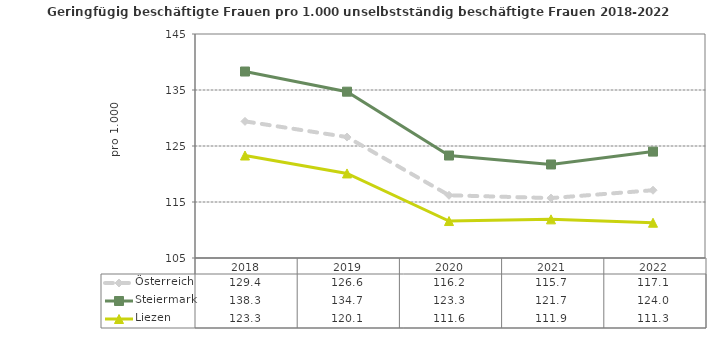
| Category | Österreich | Steiermark | Liezen |
|---|---|---|---|
| 2022.0 | 117.1 | 124 | 111.3 |
| 2021.0 | 115.7 | 121.7 | 111.9 |
| 2020.0 | 116.2 | 123.3 | 111.6 |
| 2019.0 | 126.6 | 134.7 | 120.1 |
| 2018.0 | 129.4 | 138.3 | 123.3 |